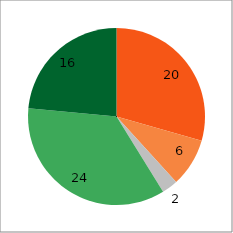
| Category | Series 0 |
|---|---|
| A rejeter | 20 |
| Mauvaise | 6 |
| Ne sais pas | 2 |
| Bonne | 24 |
|  Excellente | 16 |